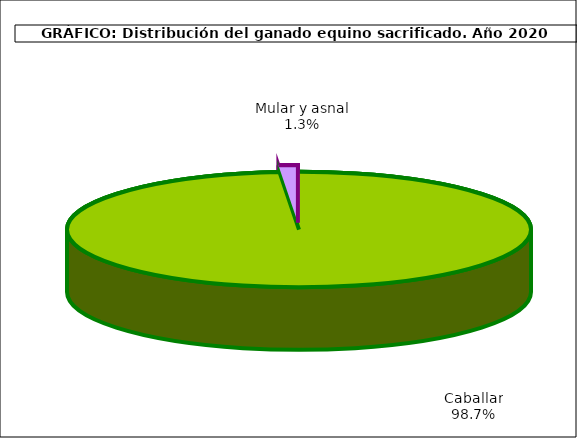
| Category | Series 0 |
|---|---|
| Caballar | 36671 |
| Mular y asnal | 498 |